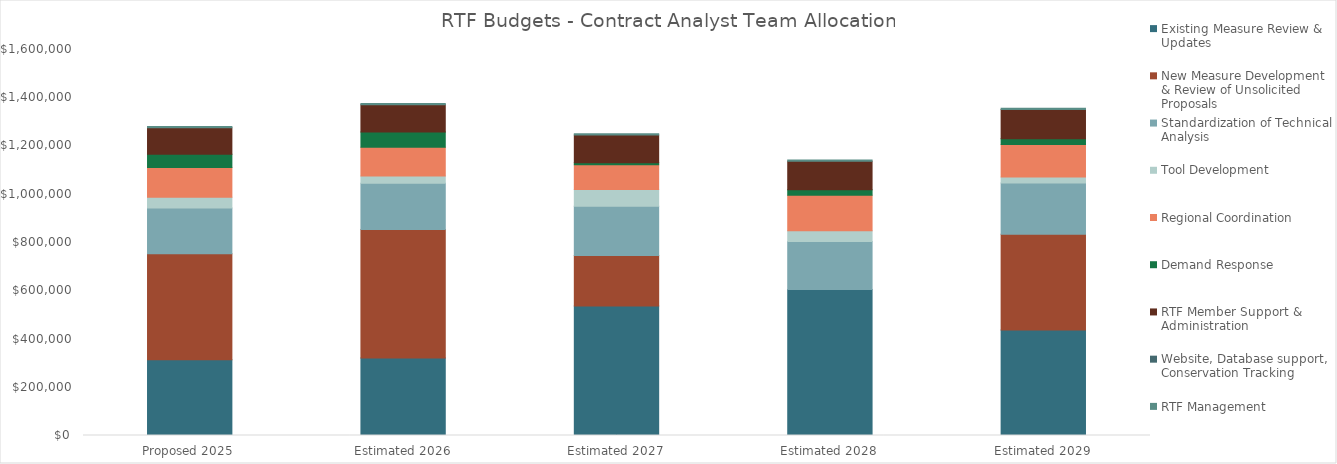
| Category | Existing Measure Review & Updates | New Measure Development & Review of Unsolicited Proposals | Standardization of Technical Analysis | Tool Development | Regional Coordination | Demand Response | RTF Member Support & Administration | Website, Database support, Conservation Tracking  | RTF Management |
|---|---|---|---|---|---|---|---|---|---|
| Proposed 2025 | 313500 | 440000 | 189500 | 45000 | 122600 | 55000 | 110000 | 0 | 5000 |
| Estimated 2026 | 321100 | 533000 | 191100 | 30000 | 120100 | 63000 | 112800 | 0 | 5000 |
| Estimated 2027 | 536300 | 210000 | 203800 | 70000 | 102000 | 8400 | 115600 | 0 | 5000 |
| Estimated 2028 | 605200 | 0 | 198600 | 45000 | 147100 | 22800 | 118500 | 0 | 5000 |
| Estimated 2029 | 436800 | 397800 | 212200 | 25000 | 134700 | 23200 | 121500 | 0 | 5000 |